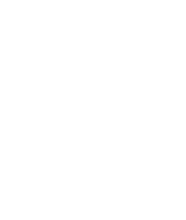
| Category | Series 0 |
|---|---|
| Teaching | 0 |
| Public engagement | 0 |
| Enterprise | 0 |
| Policy | 0 |
| Society and culture | 0 |
| Global citizenship | 0 |